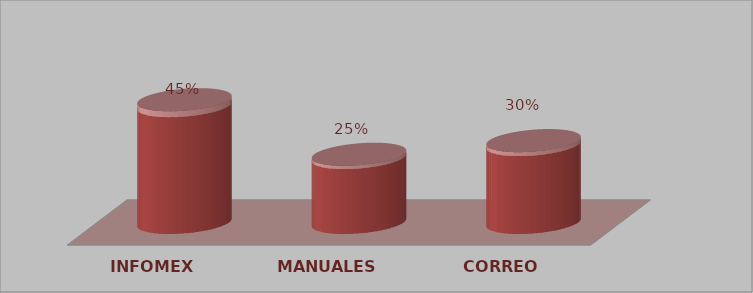
| Category | Series 0 | Series 1 |
|---|---|---|
| INFOMEX | 9 | 0.45 |
| MANUALES | 5 | 0.25 |
| CORREO | 6 | 0.3 |